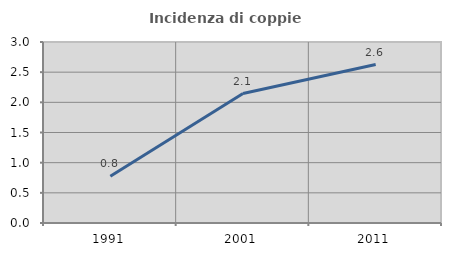
| Category | Incidenza di coppie miste |
|---|---|
| 1991.0 | 0.775 |
| 2001.0 | 2.146 |
| 2011.0 | 2.626 |